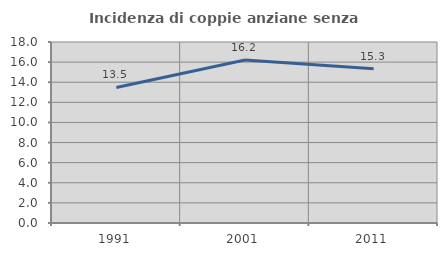
| Category | Incidenza di coppie anziane senza figli  |
|---|---|
| 1991.0 | 13.483 |
| 2001.0 | 16.206 |
| 2011.0 | 15.328 |